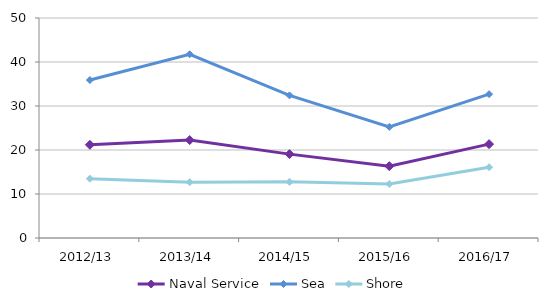
| Category | Naval Service | Sea | Shore |
|---|---|---|---|
| 2012/13 | 21.178 | 35.893 | 13.481 |
| 2013/14 | 22.256 | 41.763 | 12.68 |
| 2014/15 | 19.061 | 32.414 | 12.766 |
| 2015/16 | 16.326 | 25.24 | 12.27 |
| 2016/17 | 21.331 | 32.693 | 16.091 |